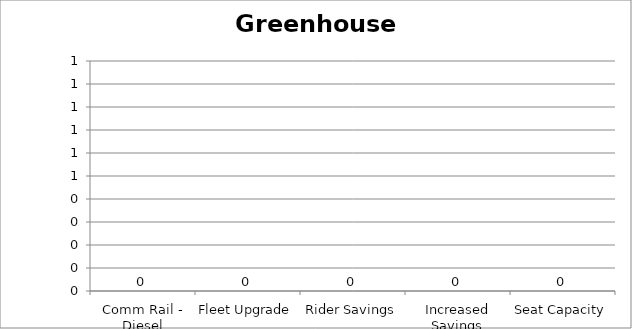
| Category | Greenhouse Gas |
|---|---|
| Comm Rail - Diesel | 0 |
| Fleet Upgrade | 0 |
| Rider Savings | 0 |
| Increased Savings | 0 |
| Seat Capacity | 0 |